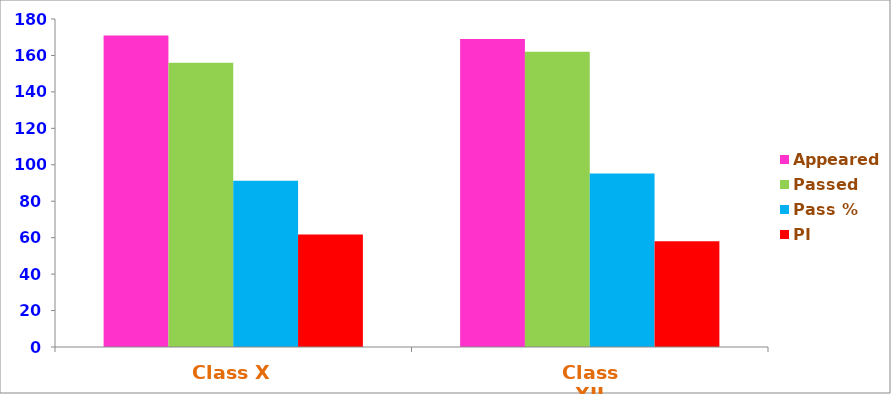
| Category | Appeared | Passed | Pass % | PI |
|---|---|---|---|---|
| Class X | 171 | 156 | 91.23 | 61.74 |
| Class XII | 169 | 162 | 95.26 | 58.02 |